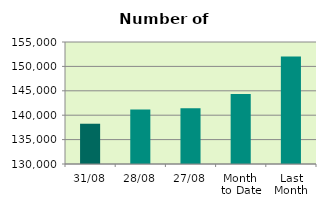
| Category | Series 0 |
|---|---|
| 31/08 | 138252 |
| 28/08 | 141170 |
| 27/08 | 141402 |
| Month 
to Date | 144368.095 |
| Last
Month | 152026.87 |